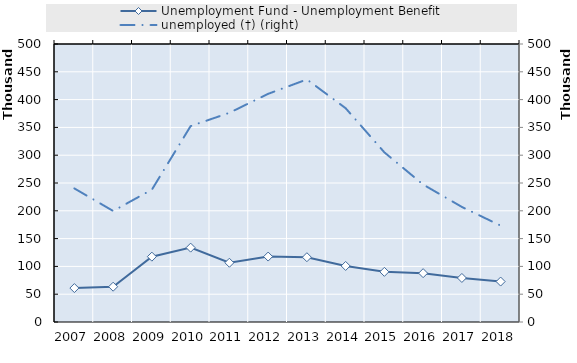
| Category | Series 4 | Series 5 | Series 6 | Series 7 | Series 8 | Series 9 | Series 10 | Series 11 | Series 12 | Series 13 | Series 14 | Series 15 | Series 16 | Series 17 | Series 18 | Series 19 | Unemployment Fund - Unemployment Benefit |
|---|---|---|---|---|---|---|---|---|---|---|---|---|---|---|---|---|---|
| 2007.0 |  |  |  |  |  |  |  |  |  |  |  |  |  |  |  |  | 61030 |
| 2008.0 |  |  |  |  |  |  |  |  |  |  |  |  |  |  |  |  | 63465 |
| 2009.0 |  |  |  |  |  |  |  |  |  |  |  |  |  |  |  |  | 117501 |
| 2010.0 |  |  |  |  |  |  |  |  |  |  |  |  |  |  |  |  | 133743.833 |
| 2011.0 |  |  |  |  |  |  |  |  |  |  |  |  |  |  |  |  | 106580 |
| 2012.0 |  |  |  |  |  |  |  |  |  |  |  |  |  |  |  |  | 117688 |
| 2013.0 |  |  |  |  |  |  |  |  |  |  |  |  |  |  |  |  | 116525 |
| 2014.0 |  |  |  |  |  |  |  |  |  |  |  |  |  |  |  |  | 100806 |
| 2015.0 |  |  |  |  |  |  |  |  |  |  |  |  |  |  |  |  | 90192 |
| 2016.0 |  |  |  |  |  |  |  |  |  |  |  |  |  |  |  |  | 87837 |
| 2017.0 |  |  |  |  |  |  |  |  |  |  |  |  |  |  |  |  | 79207 |
| 2018.0 |  |  |  |  |  |  |  |  |  |  |  |  |  |  |  |  | 72743 |